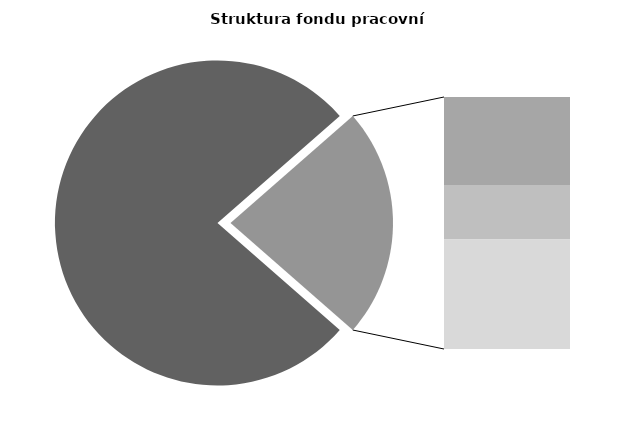
| Category | Series 0 |
|---|---|
| Průměrná měsíční odpracovaná doba bez přesčasu | 131.937 |
| Dovolená | 13.669 |
| Nemoc | 8.476 |
| Jiné | 17.013 |